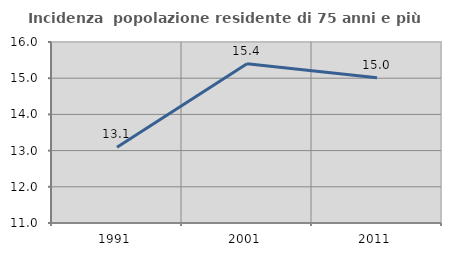
| Category | Incidenza  popolazione residente di 75 anni e più |
|---|---|
| 1991.0 | 13.095 |
| 2001.0 | 15.398 |
| 2011.0 | 15.013 |